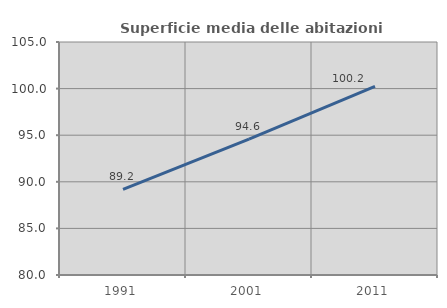
| Category | Superficie media delle abitazioni occupate |
|---|---|
| 1991.0 | 89.19 |
| 2001.0 | 94.588 |
| 2011.0 | 100.24 |